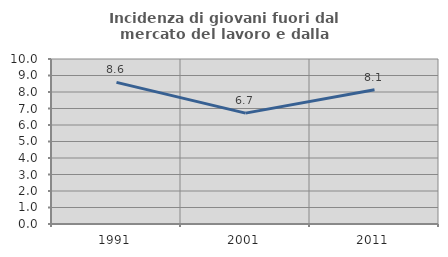
| Category | Incidenza di giovani fuori dal mercato del lavoro e dalla formazione  |
|---|---|
| 1991.0 | 8.582 |
| 2001.0 | 6.721 |
| 2011.0 | 8.14 |